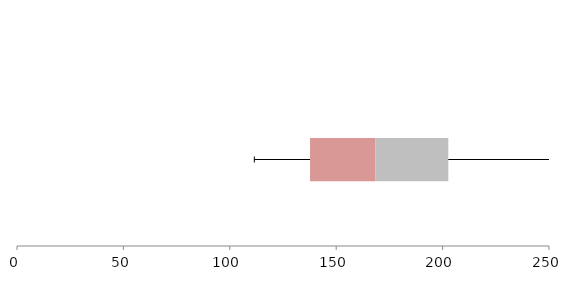
| Category | Series 1 | Series 2 | Series 3 |
|---|---|---|---|
| 0 | 137.71 | 30.746 | 34.229 |